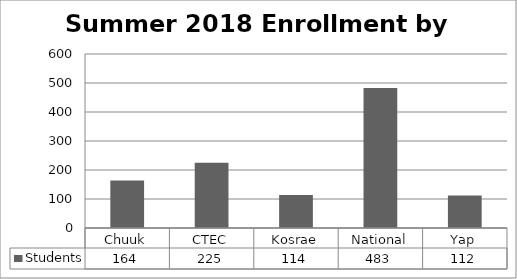
| Category | Students |
|---|---|
| Chuuk | 164 |
| CTEC | 225 |
| Kosrae | 114 |
| National | 483 |
| Yap | 112 |